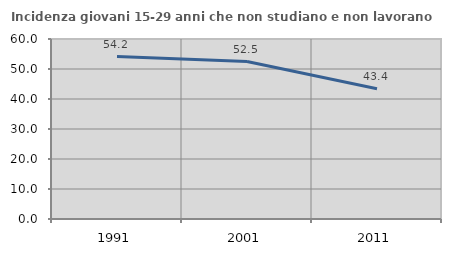
| Category | Incidenza giovani 15-29 anni che non studiano e non lavorano  |
|---|---|
| 1991.0 | 54.15 |
| 2001.0 | 52.48 |
| 2011.0 | 43.396 |